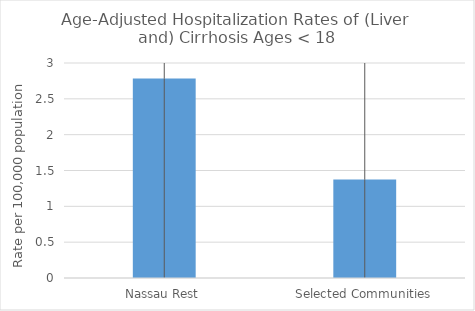
| Category | Age-Adjusted Hospitalization Rates of (Liver and) Cirrhosis Ages < 18 |
|---|---|
| Nassau Rest | 2.785 |
| Selected Communities | 1.374 |